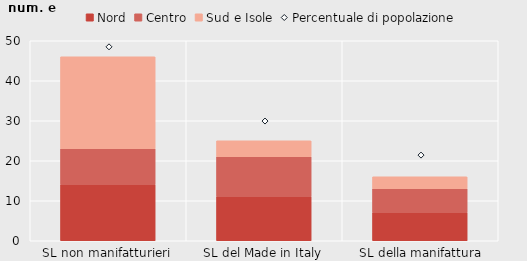
| Category | Nord | Centro | Sud e Isole |
|---|---|---|---|
| SL non manifatturieri | 14 | 9 | 23 |
| SL del Made in Italy | 11 | 10 | 4 |
| SL della manifattura pesante | 7 | 6 | 3 |